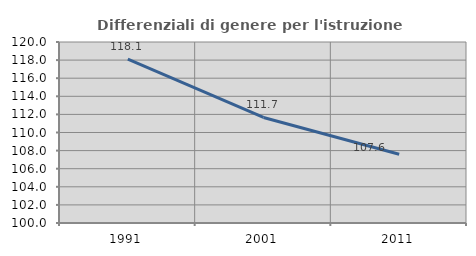
| Category | Differenziali di genere per l'istruzione superiore |
|---|---|
| 1991.0 | 118.111 |
| 2001.0 | 111.665 |
| 2011.0 | 107.604 |